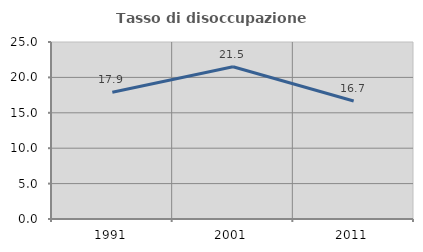
| Category | Tasso di disoccupazione giovanile  |
|---|---|
| 1991.0 | 17.91 |
| 2001.0 | 21.505 |
| 2011.0 | 16.667 |